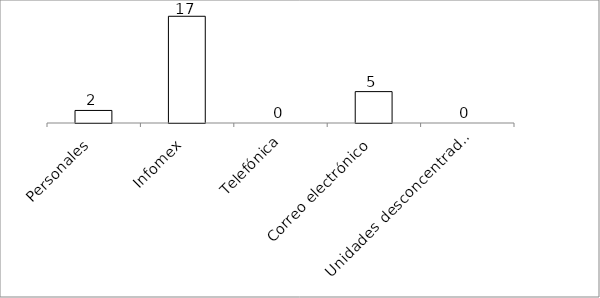
| Category | Series 0 |
|---|---|
| Personales | 2 |
| Infomex | 17 |
| Telefónica | 0 |
| Correo electrónico | 5 |
| Unidades desconcentradas | 0 |